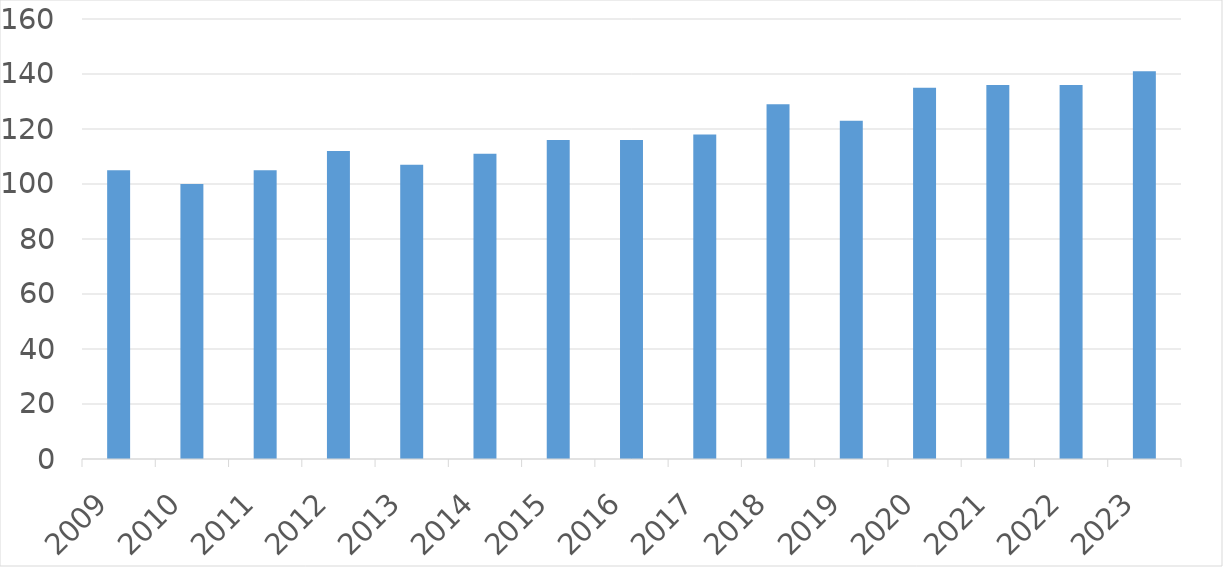
| Category | Series 0 |
|---|---|
| 2009 | 105 |
| 2010 | 100 |
| 2011 | 105 |
| 2012 | 112 |
| 2013 | 107 |
| 2014 | 111 |
| 2015 | 116 |
| 2016 | 116 |
| 2017 | 118 |
| 2018 | 129 |
| 2019 | 123 |
| 2020 | 135 |
| 2021 | 136 |
| 2022 | 136 |
| 2023 | 141 |